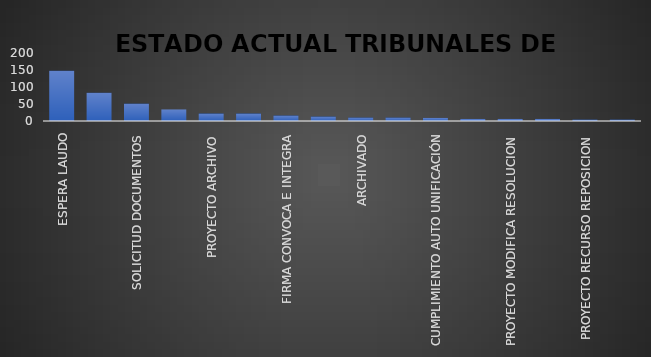
| Category | CANTIDAD | % |
|---|---|---|
| ESPERA LAUDO | 148 | 0.321 |
| RECURSO ANULACION LAUDO | 83 | 0.171 |
| SOLICITUD DOCUMENTOS | 51 | 0.117 |
| PAGO HONORARIOS | 34 | 0.059 |
| PROYECTO ARCHIVO | 22 | 0.053 |
| ESTUDIO DOCUMENTOS | 22 | 0.049 |
| FIRMA CONVOCA E INTEGRA | 16 | 0.037 |
| POSESION ARBITROS | 13 | 0.026 |
| ARCHIVADO | 10 | 0.022 |
| INVESTIGACIÓN ADMINISTRATIVA LABORAL | 10 | 0.02 |
| CUMPLIMIENTO AUTO UNIFICACIÓN | 9 | 0.02 |
| DESIGNACION ARBITRO | 6 | 0.016 |
| PROYECTO MODIFICA RESOLUCION | 6 | 0.013 |
| CONSTANCIA | 6 | 0.011 |
| PROYECTO RECURSO REPOSICION | 4 | 0.009 |
| AUTO CUMPLIMIENTO DE TERMINOS | 4 | 0.012 |